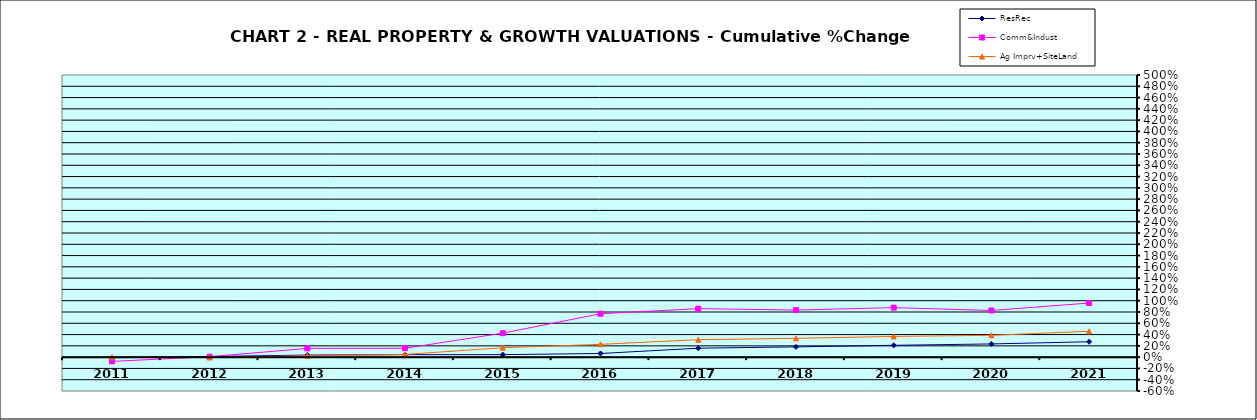
| Category | ResRec | Comm&Indust | Ag Imprv+SiteLand |
|---|---|---|---|
| 2011.0 | -0.01 | -0.075 | 0 |
| 2012.0 | 0.012 | 0.008 | -0.006 |
| 2013.0 | 0.037 | 0.155 | 0.024 |
| 2014.0 | 0.044 | 0.158 | 0.047 |
| 2015.0 | 0.044 | 0.425 | 0.167 |
| 2016.0 | 0.065 | 0.77 | 0.227 |
| 2017.0 | 0.159 | 0.859 | 0.309 |
| 2018.0 | 0.182 | 0.834 | 0.334 |
| 2019.0 | 0.209 | 0.877 | 0.367 |
| 2020.0 | 0.234 | 0.827 | 0.387 |
| 2021.0 | 0.273 | 0.959 | 0.458 |